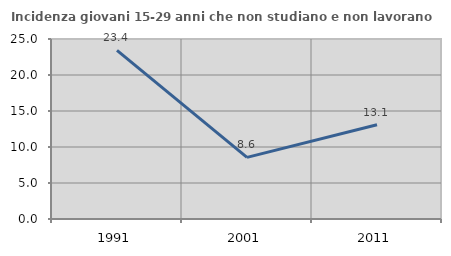
| Category | Incidenza giovani 15-29 anni che non studiano e non lavorano  |
|---|---|
| 1991.0 | 23.415 |
| 2001.0 | 8.558 |
| 2011.0 | 13.1 |